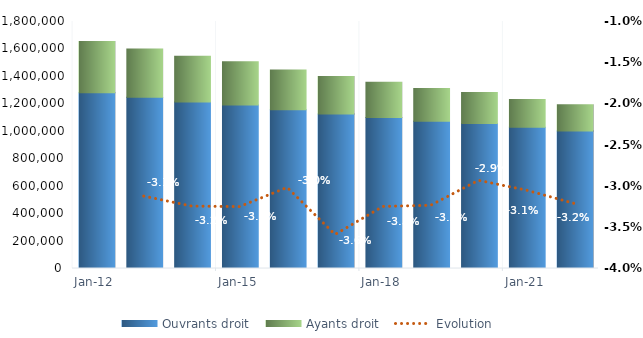
| Category | Ouvrants droit | Ayants droit |
|---|---|---|
| 40909.0 | 1281546 | 372445 |
| 41275.0 | 1247695 | 352055 |
| 41640.0 | 1214096 | 332856 |
| 42005.0 | 1192096 | 315017 |
| 42370.0 | 1156226 | 290817 |
| 42736.0 | 1126293 | 273413 |
| 43101.0 | 1100063 | 256853 |
| 43466.0 | 1073235 | 238295 |
| 43831.0 | 1056297 | 225840 |
| 44197.0 | 1029172 | 203104 |
| 44562.0 | 1002903 | 189739 |